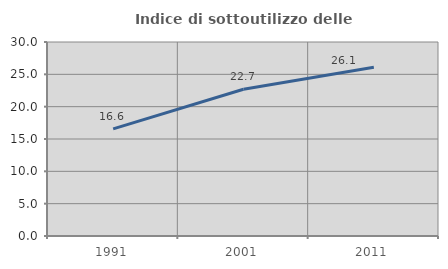
| Category | Indice di sottoutilizzo delle abitazioni  |
|---|---|
| 1991.0 | 16.569 |
| 2001.0 | 22.694 |
| 2011.0 | 26.091 |